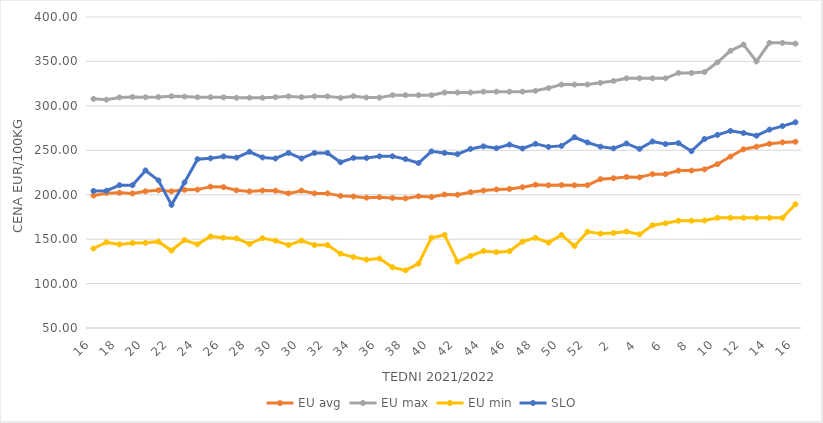
| Category | EU avg | EU max | EU min | SLO |
|---|---|---|---|---|
| 16.0 | 199.1 | 307.87 | 139.462 | 204.2 |
| 17.0 | 201.754 | 306.98 | 146.538 | 204.51 |
| 18.0 | 202.13 | 309.49 | 144.017 | 210.72 |
| 19.0 | 201.439 | 310.06 | 145.644 | 210.68 |
| 20.0 | 203.834 | 309.69 | 145.911 | 227.32 |
| 21.0 | 205.04 | 309.99 | 147.188 | 216.08 |
| 22.0 | 203.79 | 310.76 | 137.177 | 188.6 |
| 23.0 | 205.51 | 310.41 | 148.928 | 213.84 |
| 24.0 | 205.73 | 309.64 | 144.161 | 239.99 |
| 25.0 | 209.095 | 309.74 | 153.081 | 240.99 |
| 26.0 | 208.551 | 309.55 | 151.599 | 243.11 |
| 27.0 | 204.914 | 309.08 | 150.789 | 241.72 |
| 28.0 | 203.681 | 309.21 | 144.56 | 248.33 |
| 29.0 | 204.773 | 309.15 | 151.052 | 241.96 |
| 30.0 | 204.558 | 309.78 | 148.33 | 240.79 |
| 31.0 | 201.483 | 310.67 | 143.33 | 247 |
| 30.0 | 204.558 | 309.78 | 148.33 | 240.79 |
| 31.0 | 201.483 | 310.67 | 143.33 | 247 |
| 32.0 | 201.483 | 310.67 | 143.33 | 247 |
| 33.0 | 198.691 | 309 | 133.607 | 236.54 |
| 34.0 | 198.027 | 310.9 | 129.797 | 241.45 |
| 35.0 | 196.72 | 309.41 | 126.926 | 241.39 |
| 36.0 | 197.157 | 309.28 | 128.099 | 243.19 |
| 37.0 | 196.375 | 312 | 118.364 | 243.28 |
| 38.0 | 195.821 | 312 | 114.892 | 240.06 |
| 39.0 | 198.179 | 312 | 122.517 | 235.66 |
| 40.0 | 197.482 | 312 | 151.488 | 248.77 |
| 41.0 | 200.22 | 315 | 154.74 | 247.07 |
| 42.0 | 199.965 | 315 | 124.748 | 245.64 |
| 43.0 | 202.804 | 315 | 131.104 | 251.53 |
| 44.0 | 204.713 | 316 | 136.6 | 254.42 |
| 45.0 | 205.906 | 316 | 135.362 | 252.35 |
| 46.0 | 206.476 | 316 | 136.39 | 256.33 |
| 47.0 | 208.415 | 316 | 147.192 | 252.01 |
| 48.0 | 211.314 | 317 | 151.41 | 257.25 |
| 49.0 | 210.677 | 320 | 146.064 | 253.87 |
| 50.0 | 210.823 | 324 | 154.698 | 254.94 |
| 51.0 | 210.59 | 324 | 142.382 | 264.65 |
| 52.0 | 210.763 | 324 | 158.333 | 258.8 |
| 1.0 | 217.49 | 326 | 156.222 | 254.09 |
| 2.0 | 218.55 | 328 | 156.969 | 252.15 |
| 3.0 | 219.967 | 331 | 158.511 | 257.65 |
| 4.0 | 219.57 | 331 | 155.346 | 251.6 |
| 5.0 | 223.136 | 331 | 165.59 | 259.87 |
| 6.0 | 223.143 | 331 | 167.86 | 256.97 |
| 7.0 | 227.138 | 337 | 170.719 | 258.07 |
| 8.0 | 227.191 | 337 | 170.743 | 248.97 |
| 9.0 | 228.512 | 338 | 170.92 | 262.72 |
| 10.0 | 234.369 | 349 | 174 | 267.38 |
| 11.0 | 242.946 | 362 | 174 | 271.86 |
| 12.0 | 251.132 | 369 | 174 | 269.43 |
| 13.0 | 254.061 | 350 | 174 | 266.39 |
| 14.0 | 257.367 | 371 | 174 | 273.3 |
| 15.0 | 258.893 | 371 | 174 | 277.18 |
| 16.0 | 259.647 | 370 | 189.274 | 281.55 |